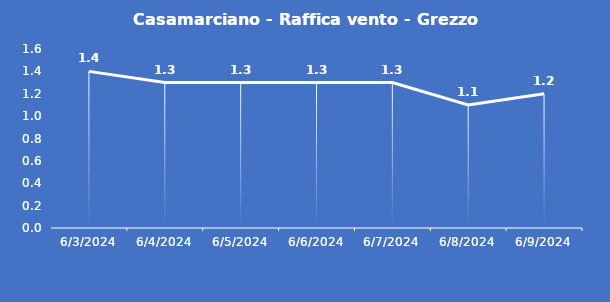
| Category | Casamarciano - Raffica vento - Grezzo (m/s) |
|---|---|
| 6/3/24 | 1.4 |
| 6/4/24 | 1.3 |
| 6/5/24 | 1.3 |
| 6/6/24 | 1.3 |
| 6/7/24 | 1.3 |
| 6/8/24 | 1.1 |
| 6/9/24 | 1.2 |